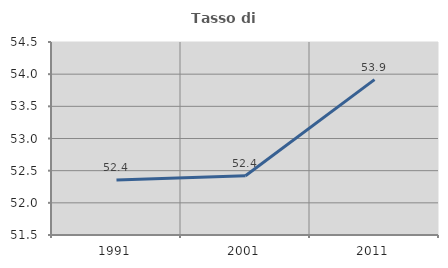
| Category | Tasso di occupazione   |
|---|---|
| 1991.0 | 52.355 |
| 2001.0 | 52.42 |
| 2011.0 | 53.915 |